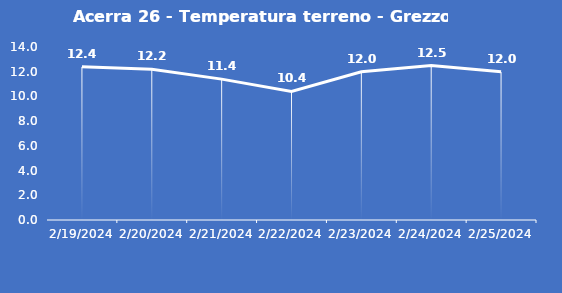
| Category | Acerra 26 - Temperatura terreno - Grezzo (°C) |
|---|---|
| 2/19/24 | 12.4 |
| 2/20/24 | 12.2 |
| 2/21/24 | 11.4 |
| 2/22/24 | 10.4 |
| 2/23/24 | 12 |
| 2/24/24 | 12.5 |
| 2/25/24 | 12 |